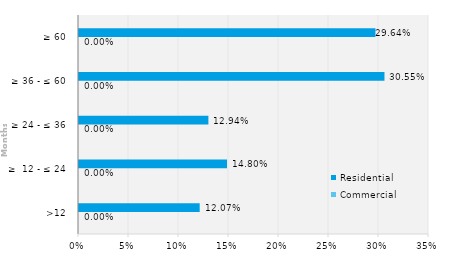
| Category | Commercial | Residential |
|---|---|---|
| >12 | 0 | 0.121 |
| ≥  12 - ≤ 24 | 0 | 0.148 |
| ≥ 24 - ≤ 36 | 0 | 0.129 |
| ≥ 36 - ≤ 60 | 0 | 0.305 |
| ≥ 60 | 0 | 0.296 |